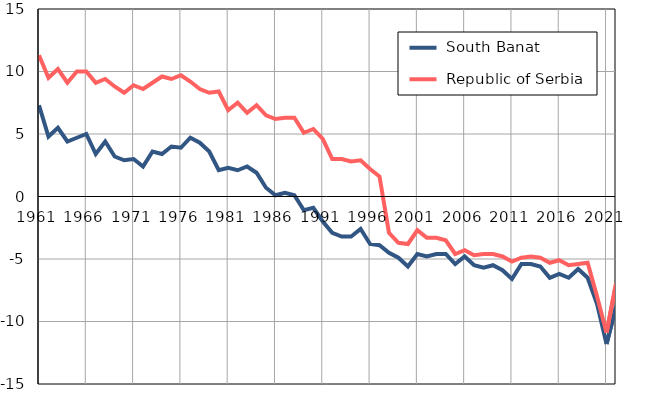
| Category |  South Banat |  Republic of Serbia |
|---|---|---|
| 1961.0 | 7.3 | 11.3 |
| 1962.0 | 4.8 | 9.5 |
| 1963.0 | 5.5 | 10.2 |
| 1964.0 | 4.4 | 9.1 |
| 1965.0 | 4.7 | 10 |
| 1966.0 | 5 | 10 |
| 1967.0 | 3.4 | 9.1 |
| 1968.0 | 4.4 | 9.4 |
| 1969.0 | 3.2 | 8.8 |
| 1970.0 | 2.9 | 8.3 |
| 1971.0 | 3 | 8.9 |
| 1972.0 | 2.4 | 8.6 |
| 1973.0 | 3.6 | 9.1 |
| 1974.0 | 3.4 | 9.6 |
| 1975.0 | 4 | 9.4 |
| 1976.0 | 3.9 | 9.7 |
| 1977.0 | 4.7 | 9.2 |
| 1978.0 | 4.3 | 8.6 |
| 1979.0 | 3.6 | 8.3 |
| 1980.0 | 2.1 | 8.4 |
| 1981.0 | 2.3 | 6.9 |
| 1982.0 | 2.1 | 7.5 |
| 1983.0 | 2.4 | 6.7 |
| 1984.0 | 1.9 | 7.3 |
| 1985.0 | 0.7 | 6.5 |
| 1986.0 | 0.1 | 6.2 |
| 1987.0 | 0.3 | 6.3 |
| 1988.0 | 0.1 | 6.3 |
| 1989.0 | -1.1 | 5.1 |
| 1990.0 | -0.9 | 5.4 |
| 1991.0 | -2 | 4.6 |
| 1992.0 | -2.9 | 3 |
| 1993.0 | -3.2 | 3 |
| 1994.0 | -3.2 | 2.8 |
| 1995.0 | -2.6 | 2.9 |
| 1996.0 | -3.8 | 2.2 |
| 1997.0 | -3.9 | 1.6 |
| 1998.0 | -4.5 | -2.9 |
| 1999.0 | -4.9 | -3.7 |
| 2000.0 | -5.6 | -3.8 |
| 2001.0 | -4.6 | -2.7 |
| 2002.0 | -4.8 | -3.3 |
| 2003.0 | -4.6 | -3.3 |
| 2004.0 | -4.6 | -3.5 |
| 2005.0 | -5.4 | -4.6 |
| 2006.0 | -4.8 | -4.3 |
| 2007.0 | -5.5 | -4.7 |
| 2008.0 | -5.7 | -4.6 |
| 2009.0 | -5.5 | -4.6 |
| 2010.0 | -5.9 | -4.8 |
| 2011.0 | -6.6 | -5.2 |
| 2012.0 | -5.4 | -4.9 |
| 2013.0 | -5.4 | -4.8 |
| 2014.0 | -5.6 | -4.9 |
| 2015.0 | -6.5 | -5.3 |
| 2016.0 | -6.2 | -5.1 |
| 2017.0 | -6.5 | -5.5 |
| 2018.0 | -5.8 | -5.4 |
| 2019.0 | -6.5 | -5.3 |
| 2020.0 | -8.6 | -8 |
| 2021.0 | -11.8 | -10.9 |
| 2022.0 | -8.8 | -7 |